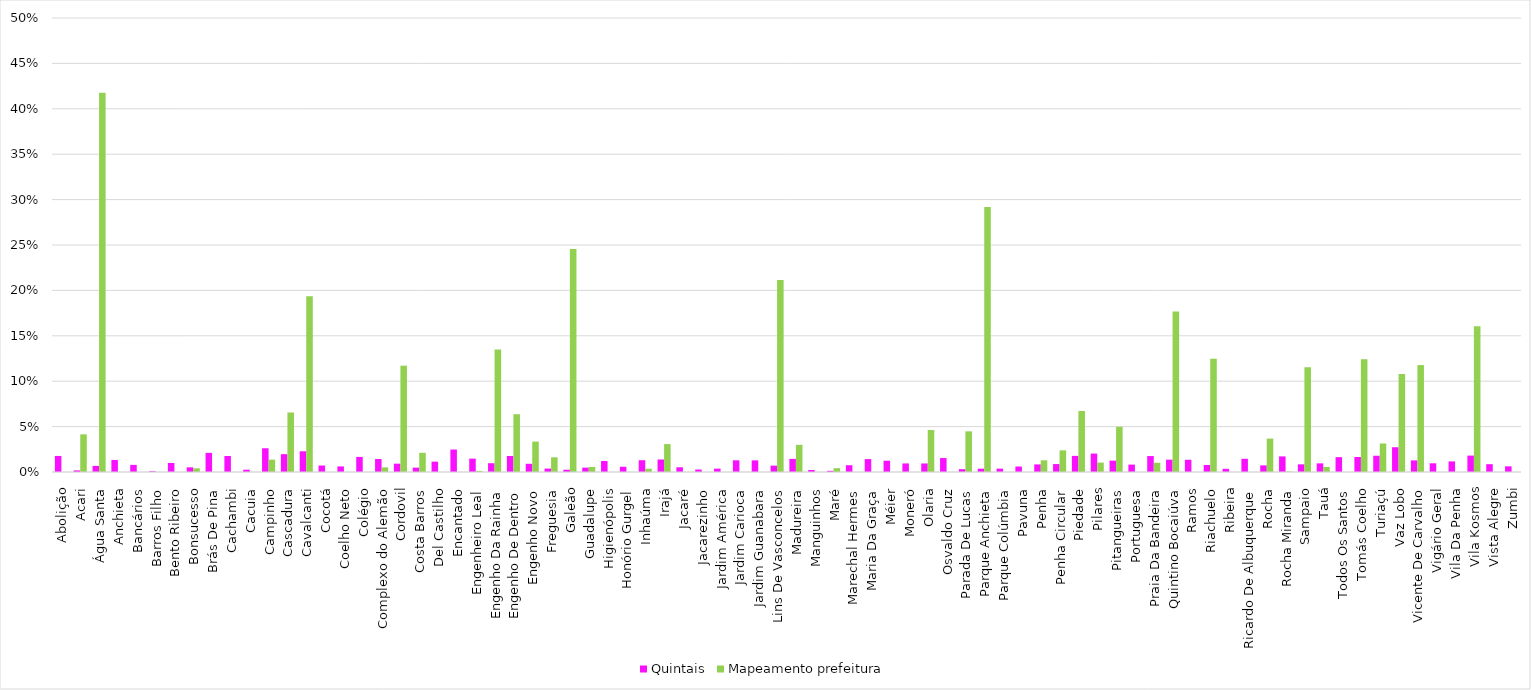
| Category | Quintais | Mapeamento prefeitura |
|---|---|---|
| Abolição | 0.018 | 0 |
| Acari | 0.002 | 0.041 |
| Água Santa | 0.007 | 0.418 |
| Anchieta | 0.013 | 0 |
| Bancários | 0.008 | 0 |
| Barros Filho | 0.001 | 0 |
| Bento Ribeiro | 0.01 | 0 |
| Bonsucesso | 0.005 | 0.004 |
| Brás De Pina | 0.021 | 0 |
| Cachambi | 0.018 | 0 |
| Cacuia | 0.003 | 0 |
| Campinho | 0.026 | 0.014 |
| Cascadura | 0.02 | 0.066 |
| Cavalcanti | 0.023 | 0.194 |
| Cocotá | 0.007 | 0 |
| Coelho Neto | 0.006 | 0 |
| Colégio | 0.017 | 0 |
| Complexo do Alemão | 0.014 | 0.005 |
| Cordovil | 0.009 | 0.117 |
| Costa Barros | 0.005 | 0.021 |
| Del Castilho | 0.011 | 0 |
| Encantado | 0.025 | 0 |
| Engenheiro Leal | 0.015 | 0.001 |
| Engenho Da Rainha | 0.01 | 0.135 |
| Engenho De Dentro | 0.018 | 0.064 |
| Engenho Novo | 0.009 | 0.034 |
| Freguesia | 0.004 | 0.016 |
| Galeão | 0.003 | 0.246 |
| Guadalupe | 0.005 | 0.006 |
| Higienópolis | 0.012 | 0 |
| Honório Gurgel | 0.006 | 0 |
| Inhaúma | 0.013 | 0.004 |
| Irajá | 0.014 | 0.031 |
| Jacaré | 0.005 | 0 |
| Jacarezinho | 0.003 | 0 |
| Jardim América | 0.004 | 0 |
| Jardim Carioca | 0.013 | 0 |
| Jardim Guanabara | 0.013 | 0 |
| Lins De Vasconcelos | 0.007 | 0.212 |
| Madureira | 0.014 | 0.03 |
| Manguinhos | 0.002 | 0 |
| Maré | 0.001 | 0.004 |
| Marechal Hermes | 0.007 | 0 |
| Maria Da Graça | 0.014 | 0 |
| Méier | 0.012 | 0 |
| Moneró | 0.009 | 0 |
| Olaria | 0.009 | 0.046 |
| Osvaldo Cruz | 0.015 | 0 |
| Parada De Lucas | 0.003 | 0.045 |
| Parque Anchieta | 0.004 | 0.292 |
| Parque Colúmbia | 0.004 | 0 |
| Pavuna | 0.006 | 0 |
| Penha | 0.008 | 0.013 |
| Penha Circular | 0.009 | 0.024 |
| Piedade | 0.018 | 0.067 |
| Pilares | 0.02 | 0.01 |
| Pitangueiras | 0.013 | 0.05 |
| Portuguesa | 0.008 | 0 |
| Praia Da Bandeira | 0.018 | 0.01 |
| Quintino Bocaiúva | 0.014 | 0.177 |
| Ramos | 0.013 | 0 |
| Riachuelo | 0.008 | 0.125 |
| Ribeira | 0.003 | 0 |
| Ricardo De Albuquerque | 0.015 | 0 |
| Rocha | 0.007 | 0.037 |
| Rocha Miranda | 0.017 | 0.001 |
| Sampaio | 0.008 | 0.115 |
| Tauá | 0.01 | 0.006 |
| Todos Os Santos | 0.016 | 0 |
| Tomás Coelho | 0.017 | 0.124 |
| Turiaçú | 0.018 | 0.031 |
| Vaz Lobo | 0.027 | 0.108 |
| Vicente De Carvalho | 0.013 | 0.118 |
| Vigário Geral | 0.01 | 0 |
| Vila Da Penha | 0.012 | 0 |
| Vila Kosmos | 0.018 | 0.16 |
| Vista Alegre | 0.009 | 0 |
| Zumbi | 0.006 | 0 |